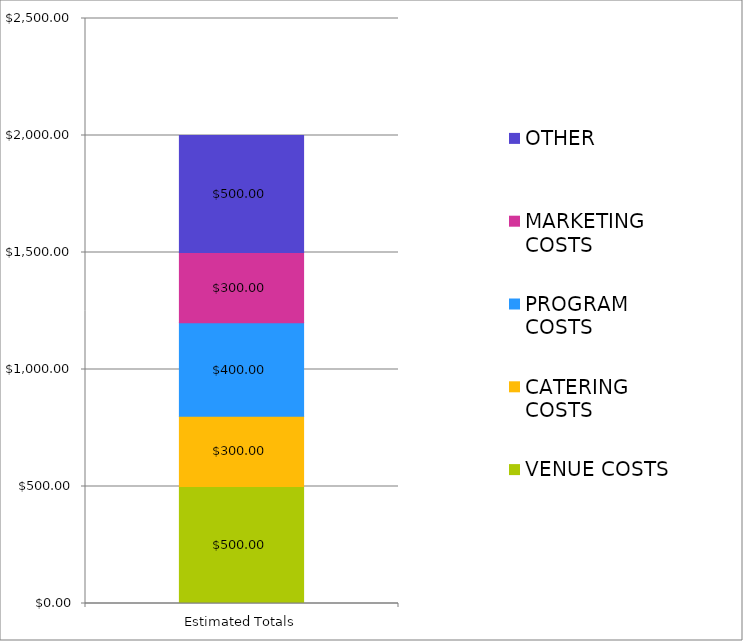
| Category | VENUE COSTS | CATERING COSTS | PROGRAM COSTS | MARKETING COSTS | OTHER |
|---|---|---|---|---|---|
| Estimated Totals | 500 | 300 | 400 | 300 | 500 |